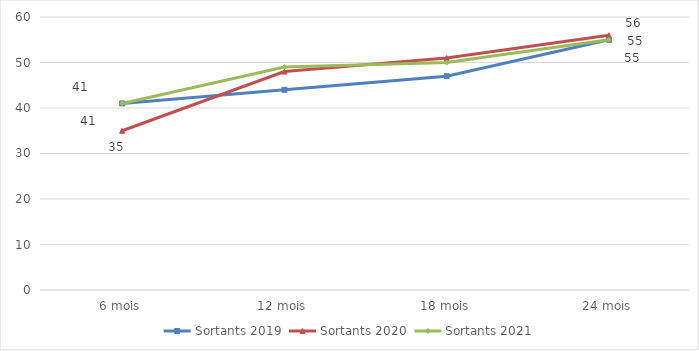
| Category | Sortants 2019 | Sortants 2020 | Sortants 2021 |
|---|---|---|---|
| 6 mois | 41 | 35 | 41 |
| 12 mois | 44 | 48 | 49 |
| 18 mois | 47 | 51 | 50 |
| 24 mois | 55 | 56 | 55 |